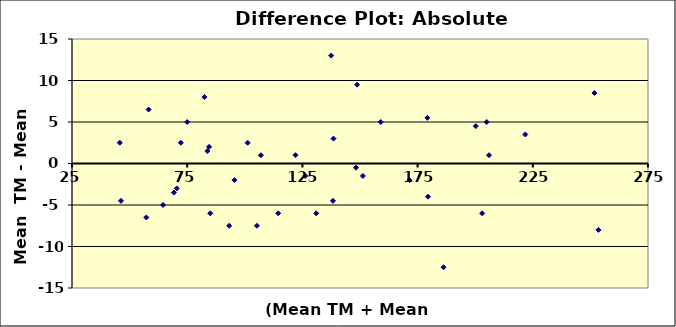
| Category | Series 0 |
|---|---|
| 83.75 | 1.5 |
| 159.0 | 5 |
| 200.25 | 4.5 |
| 46.25 | -4.5 |
| 70.5 | -3 |
| 179.25 | 5.5 |
| 221.75 | 3.5 |
| 138.5 | 3 |
| 171.5 | -2 |
| 82.5 | 8 |
| 148.25 | -0.5 |
| 251.75 | 8.5 |
| 45.75 | 2.5 |
| 93.25 | -7.5 |
| 72.25 | 2.5 |
| 58.25 | 6.5 |
| 151.25 | -1.5 |
| 206.0 | 1 |
| 105.25 | -7.5 |
| 122.0 | 1 |
| 131.0 | -6 |
| 101.25 | 2.5 |
| 205.0 | 5 |
| 69.25 | -3.5 |
| 186.25 | -12.5 |
| 95.5 | -2 |
| 137.5 | 13 |
| 114.5 | -6 |
| 85.0 | -6 |
| 203.0 | -6 |
| 148.75 | 9.5 |
| 75.0 | 5 |
| 57.25 | -6.5 |
| 179.5 | -4 |
| 253.5 | -8 |
| 126.25 | -1.5 |
| 84.5 | 2 |
| 64.5 | -5 |
| 138.25 | -4.5 |
| 107.0 | 1 |